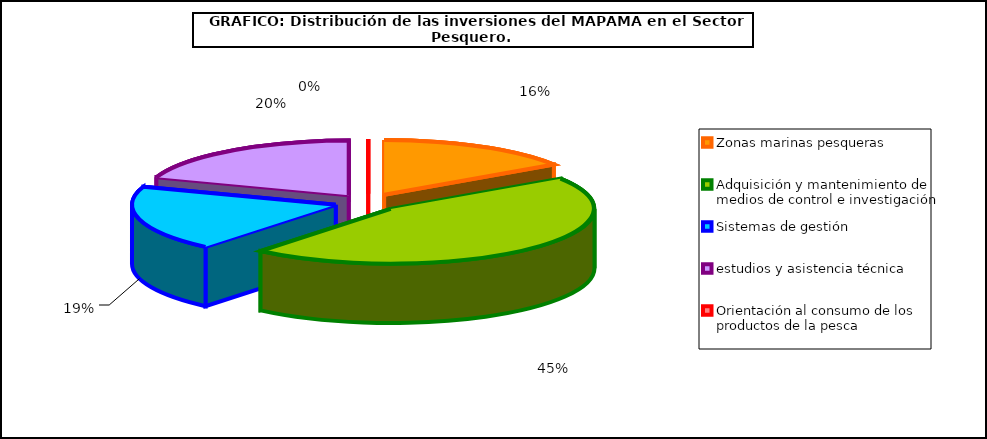
| Category | Series 0 |
|---|---|
| 0 | 3582.01 |
| 1 | 10371.72 |
| 2 | 4416.63 |
| 3 | 4491.72 |
| 4 | 0 |